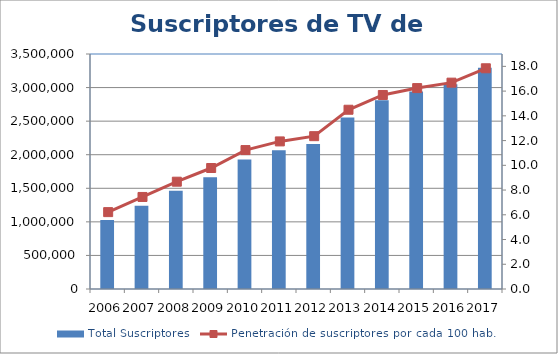
| Category | Total Suscriptores |
|---|---|
| 0 | 1026667 |
| 1 | 1241346 |
| 2 | 1461490 |
| 3 | 1664032 |
| 4 | 1928694 |
| 5 | 2067368 |
| 6 | 2159979 |
| 7 | 2555620 |
| 8 | 2809981 |
| 9 | 2940023 |
| 10 | 3050347 |
| 11 | 3294954 |